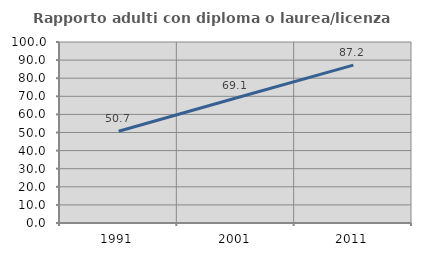
| Category | Rapporto adulti con diploma o laurea/licenza media  |
|---|---|
| 1991.0 | 50.704 |
| 2001.0 | 69.072 |
| 2011.0 | 87.234 |